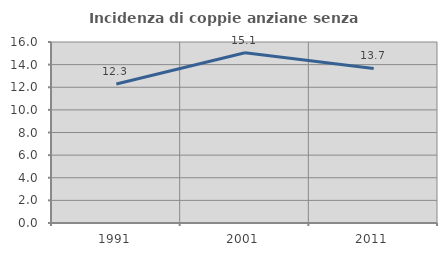
| Category | Incidenza di coppie anziane senza figli  |
|---|---|
| 1991.0 | 12.291 |
| 2001.0 | 15.054 |
| 2011.0 | 13.661 |